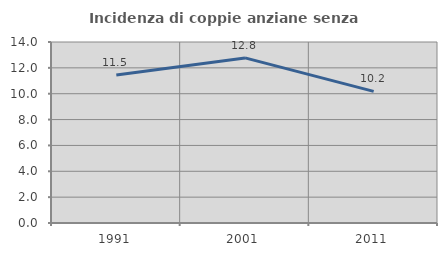
| Category | Incidenza di coppie anziane senza figli  |
|---|---|
| 1991.0 | 11.453 |
| 2001.0 | 12.771 |
| 2011.0 | 10.183 |